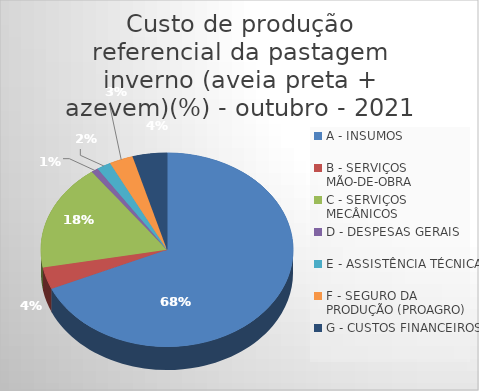
| Category | Series 0 |
|---|---|
| A - INSUMOS | 68.398 |
| B - SERVIÇOS MÃO-DE-OBRA | 3.659 |
| C - SERVIÇOS MECÂNICOS | 17.789 |
| D - DESPESAS GERAIS  | 0.898 |
| E - ASSISTÊNCIA TÉCNICA | 1.815 |
| F - SEGURO DA PRODUÇÃO (PROAGRO) | 3.044 |
| G - CUSTOS FINANCEIROS | 4.398 |